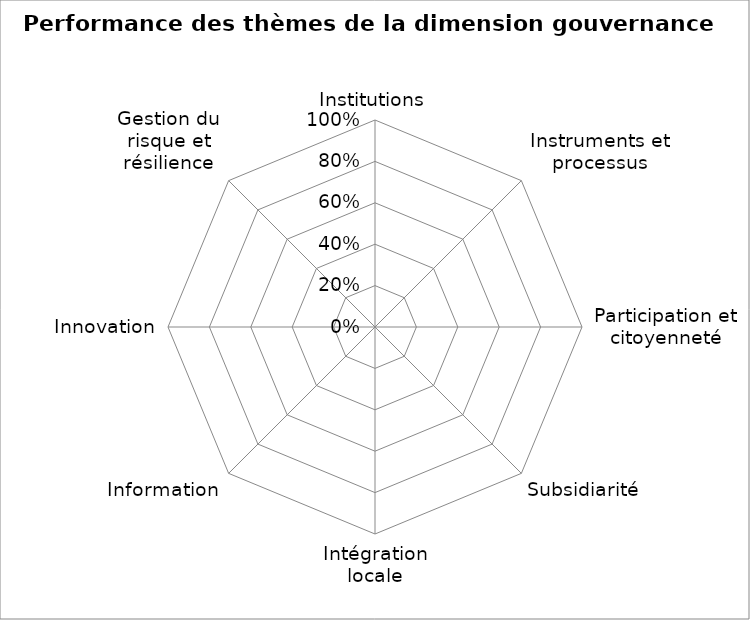
| Category | Series 0 |
|---|---|
| Institutions | 0 |
| Instruments et processus | 0 |
| Participation et citoyenneté | 0 |
| Subsidiarité | 0 |
| Intégration locale | 0 |
| Information | 0 |
| Innovation | 0 |
| Gestion du risque et résilience | 0 |